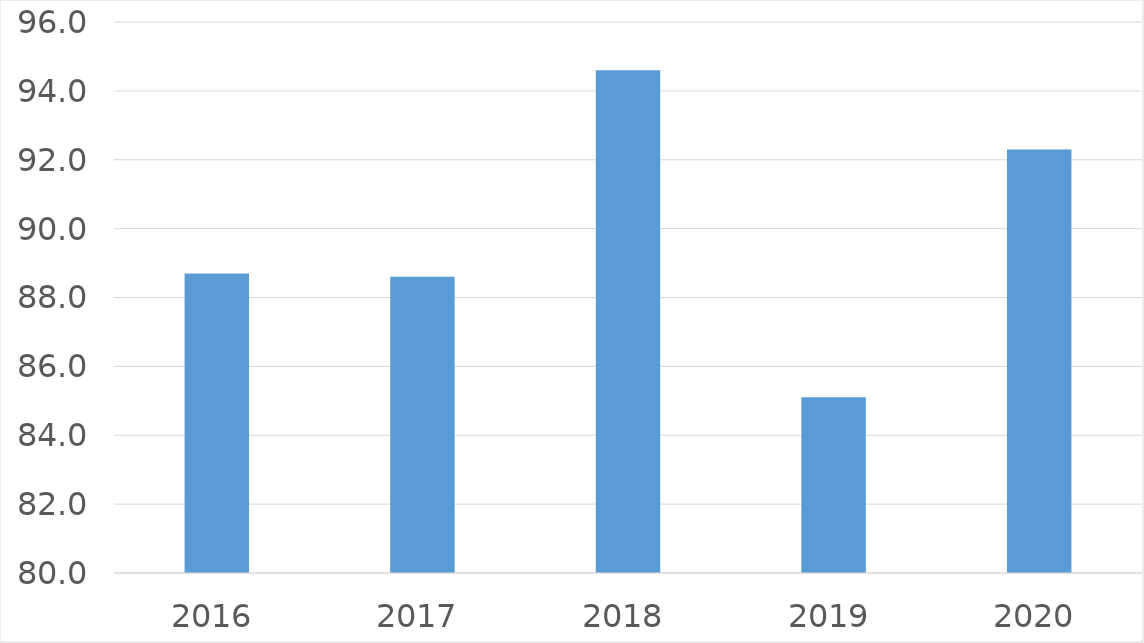
| Category | Series 0 |
|---|---|
| 2016 | 88.7 |
| 2017 | 88.6 |
| 2018 | 94.6 |
| 2019 | 85.1 |
| 2020 | 92.3 |